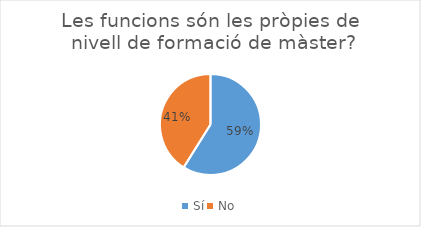
| Category | Series 0 |
|---|---|
| Sí | 53 |
| No | 37 |